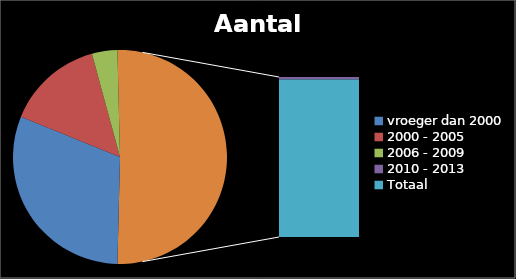
| Category | Aantal |
|---|---|
| vroeger dan 2000 | 40 |
| 2000 - 2005 | 19 |
| 2006 - 2009 | 5 |
| 2010 - 2013 | 1 |
| Totaal | 65 |